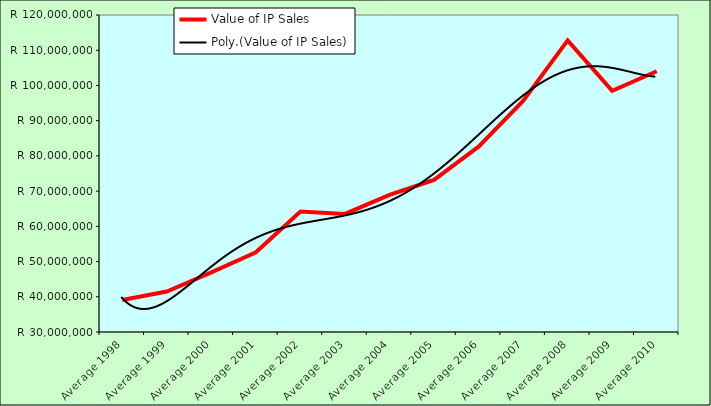
| Category | Value of IP Sales |
|---|---|
| Average 1998 | 39064997.167 |
| Average 1999 | 41498816.583 |
| Average 2000 | 46906615.833 |
| Average 2001 | 52614116.083 |
| Average 2002 | 64216592.5 |
| Average 2003 | 63518696.833 |
| Average 2004 | 68920125.583 |
| Average 2005 | 73199986.5 |
| Average 2006 | 82623586.75 |
| Average 2007 | 95629656.182 |
| Average 2008 | 112782411.583 |
| Average 2009 | 98475086.75 |
| Average 2010 | 104041836 |